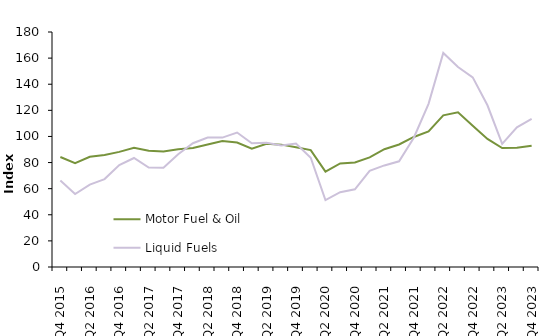
| Category | Motor Fuel & Oil | Liquid Fuels |
|---|---|---|
| Q4 2015 | 84.226 | 66.229 |
| Q1 2016 | 79.583 | 55.844 |
| Q2 2016 | 84.466 | 63.127 |
| Q3 2016 | 85.819 | 67.331 |
| Q4 2016 | 88.193 | 78.144 |
| Q1 2017 | 91.399 | 83.508 |
| Q2 2017 | 89.012 | 76.202 |
| Q3 2017 | 88.493 | 76.05 |
| Q4 2017 | 90.202 | 86.405 |
| Q1 2018 | 91.195 | 94.814 |
| Q2 2018 | 93.898 | 99.179 |
| Q3 2018 | 96.5 | 99.102 |
| Q4 2018 | 95.389 | 102.971 |
| Q1 2019 | 90.59 | 94.736 |
| Q2 2019 | 94.365 | 95.239 |
| Q3 2019 | 93.732 | 93.16 |
| Q4 2019 | 91.798 | 94.617 |
| Q1 2020 | 89.535 | 83.729 |
| Q2 2020 | 73.093 | 51.246 |
| Q3 2020 | 79.348 | 57.272 |
| Q4 2020 | 80.041 | 59.496 |
| Q1 2021 | 83.922 | 73.637 |
| Q2 2021 | 90.248 | 77.806 |
| Q3 2021 | 93.861 | 80.966 |
| Q4 2021 | 99.607 | 98.995 |
| Q1 2022 | 103.852 | 124.967 |
| Q2 2022 | 116.173 | 163.975 |
| Q3 2022 | 118.512 | 153.15 |
| Q4 2022 | 108.187 | 145.278 |
| Q1 2023 | 98.072 | 123.878 |
| Q2 2023 | 91.061 | 94.288 |
| Q3 2023 | 91.265 | 106.953 |
| Q4 2023 | 92.957 | 113.451 |